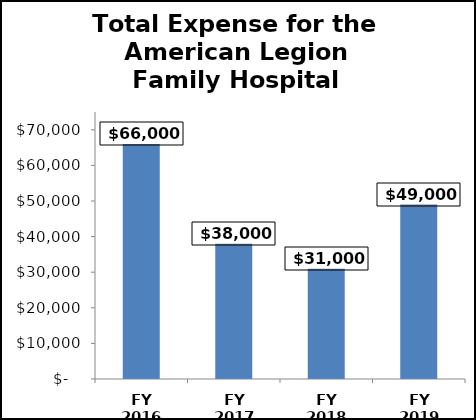
| Category | Series 0 |
|---|---|
| FY 2016 | 66000 |
| FY 2017 | 38000 |
| FY 2018 | 31000 |
| FY 2019 | 49000 |